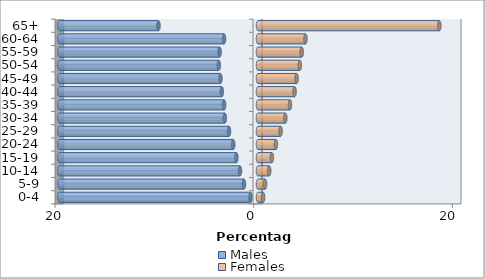
| Category | Males | Females |
|---|---|---|
| 0-4 | -0.748 | 0.514 |
| 5-9 | -1.417 | 0.709 |
| 10-14 | -1.813 | 1.126 |
| 15-19 | -2.178 | 1.397 |
| 20-24 | -2.492 | 1.802 |
| 25-29 | -2.918 | 2.274 |
| 30-34 | -3.339 | 2.75 |
| 35-39 | -3.414 | 3.219 |
| 40-44 | -3.644 | 3.683 |
| 45-49 | -3.783 | 3.888 |
| 50-54 | -3.944 | 4.211 |
| 55-59 | -3.861 | 4.405 |
| 60-64 | -3.417 | 4.779 |
| 65+ | -10.019 | 18.257 |